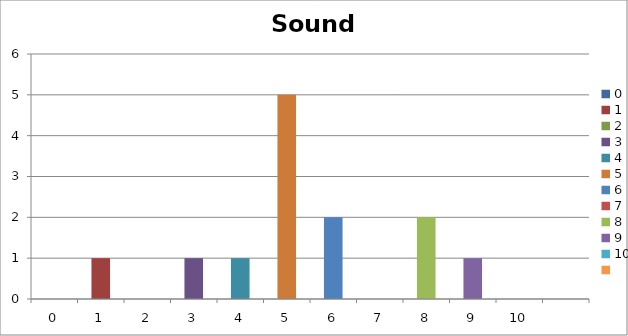
| Category | Sound Around |
|---|---|
| 0.0 | 0 |
| 1.0 | 1 |
| 2.0 | 0 |
| 3.0 | 1 |
| 4.0 | 1 |
| 5.0 | 5 |
| 6.0 | 2 |
| 7.0 | 0 |
| 8.0 | 2 |
| 9.0 | 1 |
| 10.0 | 0 |